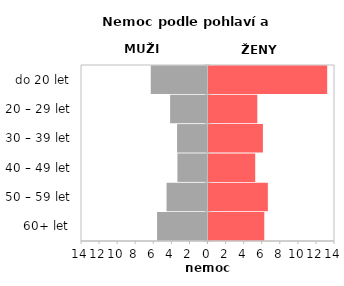
| Category | Nemoc |
|---|---|
| 60+ let | 6.175 |
| 50 – 59 let | 6.569 |
| 40 – 49 let | 5.17 |
| 30 – 39 let | 6.023 |
| 20 – 29 let | 5.4 |
| do 20 let | 13.134 |